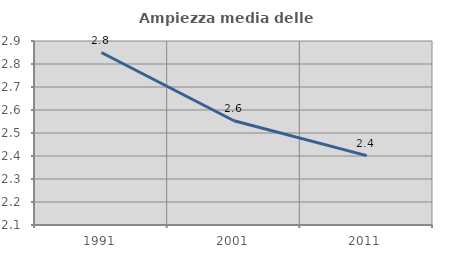
| Category | Ampiezza media delle famiglie |
|---|---|
| 1991.0 | 2.85 |
| 2001.0 | 2.553 |
| 2011.0 | 2.402 |